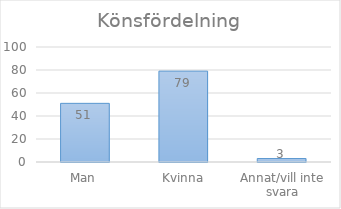
| Category | Series 0 |
|---|---|
| Man | 51 |
| Kvinna | 79 |
| Annat/vill inte svara | 3 |